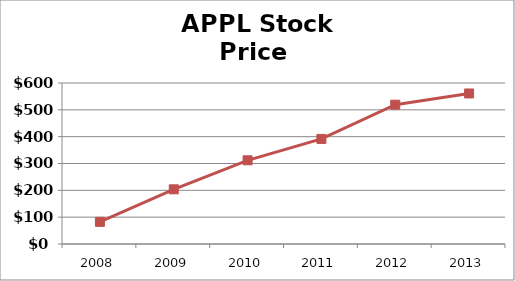
| Category | Price |
|---|---|
| 2008.0 | 82.53 |
| 2009.0 | 203.76 |
| 2010.0 | 311.89 |
| 2011.0 | 391.6 |
| 2012.0 | 519.13 |
| 2013.0 | 561.02 |